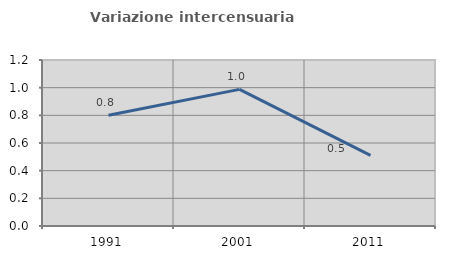
| Category | Variazione intercensuaria annua |
|---|---|
| 1991.0 | 0.801 |
| 2001.0 | 0.988 |
| 2011.0 | 0.51 |